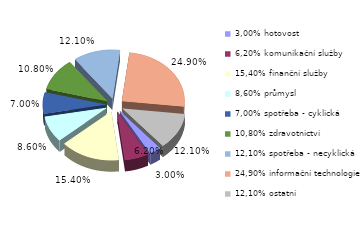
| Category | Series 0 |
|---|---|
| 3,00% hotovost | 0.03 |
| 6,20% komunikační služby | 0.062 |
| 15,40% finanční služby | 0.154 |
| 8,60% průmysl | 0.086 |
| 7,00% spotřeba - cyklická | 0.07 |
| 10,80% zdravotnictví | 0.108 |
| 12,10% spotřeba - necyklická | 0.121 |
| 24,90% informační technologie | 0.249 |
| 12,10% ostatní | 0.121 |